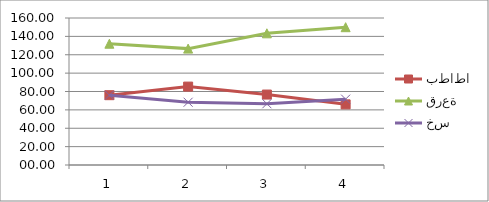
| Category | بطاطا | قرعة | خس |
|---|---|---|---|
| 0 | 76 | 132 | 76 |
| 1 | 85.33 | 126.67 | 68.33 |
| 2 | 76.67 | 143.33 | 66.67 |
| 3 | 66 | 150 | 71.67 |